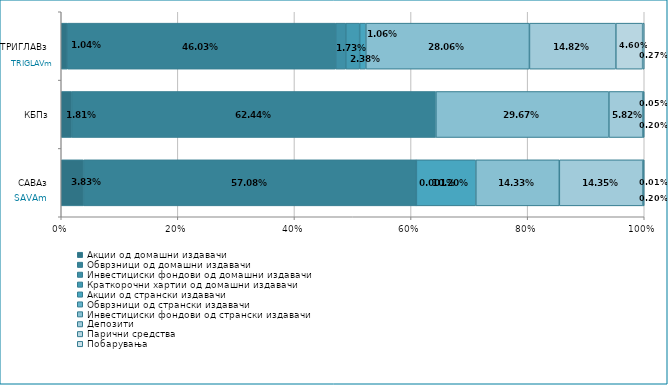
| Category | Акции од домашни издавачи  | Обврзници од домашни издавачи  | Инвестициски фондови од домашни издавачи  | Краткорочни хартии од домашни издавачи  | Акции од странски издавачи  | Обврзници од странски издавачи  | Инвестициски фондови од странски издавaчи | Депозити  | Парични средства  | Побарувања |
|---|---|---|---|---|---|---|---|---|---|---|
| САВАз | 0.038 | 0.571 | 0 | 0 | 0.102 | 0 | 0.143 | 0.143 | 0 | 0.002 |
| КБПз | 0.018 | 0.624 | 0 | 0 | 0 | 0 | 0.297 | 0.058 | 0 | 0.002 |
| ТРИГЛАВз | 0.01 | 0.46 | 0.017 | 0.024 | 0.011 | 0 | 0.281 | 0.148 | 0.046 | 0.003 |